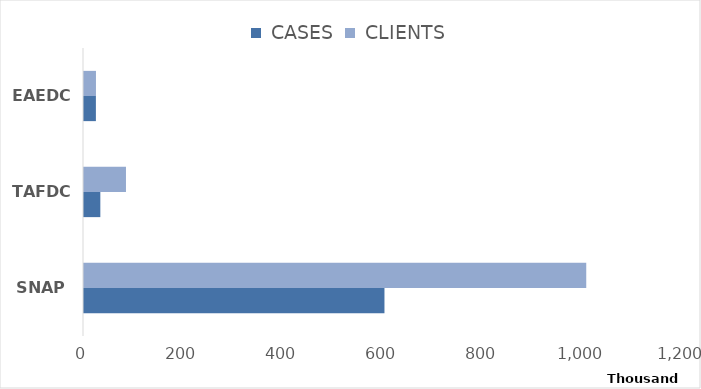
| Category |  CASES |  CLIENTS |
|---|---|---|
| SNAP | 600921 | 1004501 |
| TAFDC | 32659 | 83946 |
| EAEDC | 23789 | 23933 |